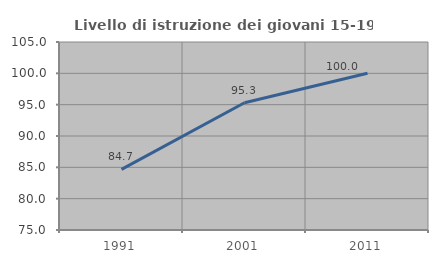
| Category | Livello di istruzione dei giovani 15-19 anni |
|---|---|
| 1991.0 | 84.674 |
| 2001.0 | 95.312 |
| 2011.0 | 100 |